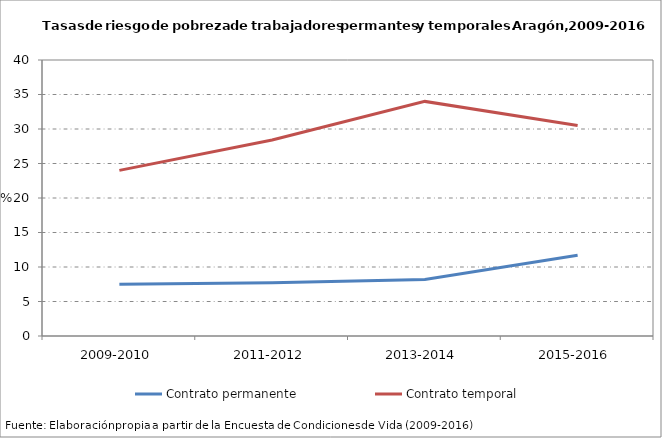
| Category | Contrato permanente | Contrato temporal |
|---|---|---|
| 2009-2010 | 7.5 | 24 |
| 2011-2012 | 7.7 | 28.4 |
| 2013-2014 | 8.2 | 34 |
| 2015-2016 | 11.7 | 30.5 |